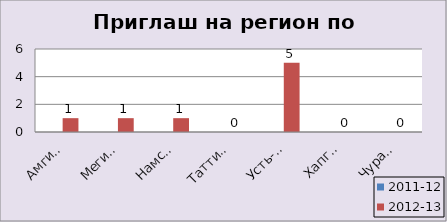
| Category | 2011-12 | 2012-13 |
|---|---|---|
| Амгинский |  | 1 |
| Мегино-Кангаласс |  | 1 |
| Намский |  | 1 |
| Таттинский |  | 0 |
| Усть-Алданский |  | 5 |
| Хапгаласский |  | 0 |
| Чурапчинский |  | 0 |